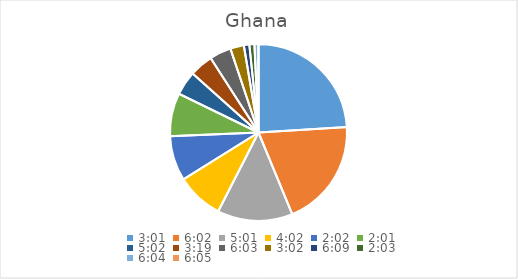
| Category | Series 0 |
|---|---|
| 0.12569444444444444 | 27.788 |
| 0.2513888888888889 | 22.88 |
| 0.20902777777777778 | 15.931 |
| 0.16805555555555554 | 9.945 |
| 0.08472222222222221 | 9.491 |
| 0.08402777777777777 | 9.148 |
| 0.20972222222222223 | 5.094 |
| 0.13819444444444443 | 4.961 |
| 0.2520833333333333 | 4.58 |
| 0.12638888888888888 | 2.874 |
| 0.25625000000000003 | 1.161 |
| 0.08541666666666665 | 1.068 |
| 0.25277777777777777 | 0.838 |
| 0.2534722222222222 | 0.015 |